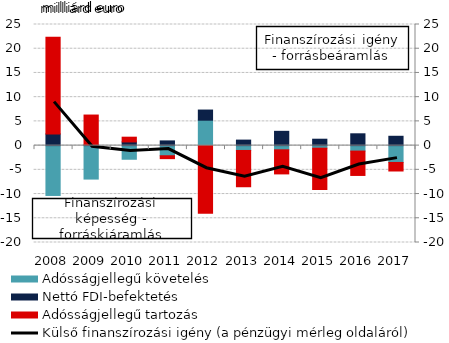
| Category | Adósságjellegű követelés | Nettó FDI-befektetés | Adósságjellegű tartozás |
|---|---|---|---|
| 2008.0 | -10.29 | 2.411 | 19.98 |
| 2009.0 | -6.907 | 0.153 | 6.158 |
| 2010.0 | -2.818 | 0.762 | 0.977 |
| 2011.0 | -2.093 | 0.972 | -0.595 |
| 2012.0 | 5.246 | 2.095 | -13.959 |
| 2013.0 | -1.003 | 1.138 | -7.489 |
| 2014.0 | -0.87 | 2.948 | -4.971 |
| 2015.0 | -0.528 | 1.321 | -8.537 |
| 2016.0 | -1.129 | 2.439 | -5.029 |
| 2017.0 | -3.476 | 1.926 | -1.763 |